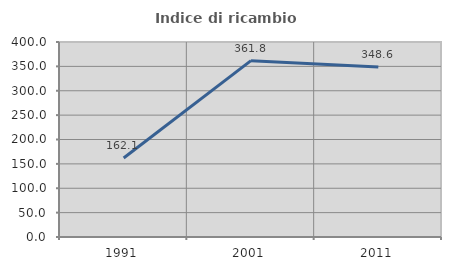
| Category | Indice di ricambio occupazionale  |
|---|---|
| 1991.0 | 162.069 |
| 2001.0 | 361.765 |
| 2011.0 | 348.649 |